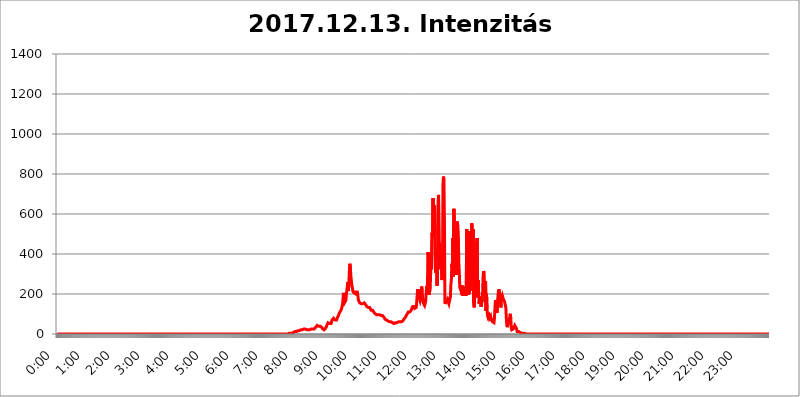
| Category | 2017.12.13. Intenzitás [W/m^2] |
|---|---|
| 0.0 | 0 |
| 0.0006944444444444445 | 0 |
| 0.001388888888888889 | 0 |
| 0.0020833333333333333 | 0 |
| 0.002777777777777778 | 0 |
| 0.003472222222222222 | 0 |
| 0.004166666666666667 | 0 |
| 0.004861111111111111 | 0 |
| 0.005555555555555556 | 0 |
| 0.0062499999999999995 | 0 |
| 0.006944444444444444 | 0 |
| 0.007638888888888889 | 0 |
| 0.008333333333333333 | 0 |
| 0.009027777777777779 | 0 |
| 0.009722222222222222 | 0 |
| 0.010416666666666666 | 0 |
| 0.011111111111111112 | 0 |
| 0.011805555555555555 | 0 |
| 0.012499999999999999 | 0 |
| 0.013194444444444444 | 0 |
| 0.013888888888888888 | 0 |
| 0.014583333333333332 | 0 |
| 0.015277777777777777 | 0 |
| 0.015972222222222224 | 0 |
| 0.016666666666666666 | 0 |
| 0.017361111111111112 | 0 |
| 0.018055555555555557 | 0 |
| 0.01875 | 0 |
| 0.019444444444444445 | 0 |
| 0.02013888888888889 | 0 |
| 0.020833333333333332 | 0 |
| 0.02152777777777778 | 0 |
| 0.022222222222222223 | 0 |
| 0.02291666666666667 | 0 |
| 0.02361111111111111 | 0 |
| 0.024305555555555556 | 0 |
| 0.024999999999999998 | 0 |
| 0.025694444444444447 | 0 |
| 0.02638888888888889 | 0 |
| 0.027083333333333334 | 0 |
| 0.027777777777777776 | 0 |
| 0.02847222222222222 | 0 |
| 0.029166666666666664 | 0 |
| 0.029861111111111113 | 0 |
| 0.030555555555555555 | 0 |
| 0.03125 | 0 |
| 0.03194444444444445 | 0 |
| 0.03263888888888889 | 0 |
| 0.03333333333333333 | 0 |
| 0.034027777777777775 | 0 |
| 0.034722222222222224 | 0 |
| 0.035416666666666666 | 0 |
| 0.036111111111111115 | 0 |
| 0.03680555555555556 | 0 |
| 0.0375 | 0 |
| 0.03819444444444444 | 0 |
| 0.03888888888888889 | 0 |
| 0.03958333333333333 | 0 |
| 0.04027777777777778 | 0 |
| 0.04097222222222222 | 0 |
| 0.041666666666666664 | 0 |
| 0.042361111111111106 | 0 |
| 0.04305555555555556 | 0 |
| 0.043750000000000004 | 0 |
| 0.044444444444444446 | 0 |
| 0.04513888888888889 | 0 |
| 0.04583333333333334 | 0 |
| 0.04652777777777778 | 0 |
| 0.04722222222222222 | 0 |
| 0.04791666666666666 | 0 |
| 0.04861111111111111 | 0 |
| 0.049305555555555554 | 0 |
| 0.049999999999999996 | 0 |
| 0.05069444444444445 | 0 |
| 0.051388888888888894 | 0 |
| 0.052083333333333336 | 0 |
| 0.05277777777777778 | 0 |
| 0.05347222222222222 | 0 |
| 0.05416666666666667 | 0 |
| 0.05486111111111111 | 0 |
| 0.05555555555555555 | 0 |
| 0.05625 | 0 |
| 0.05694444444444444 | 0 |
| 0.057638888888888885 | 0 |
| 0.05833333333333333 | 0 |
| 0.05902777777777778 | 0 |
| 0.059722222222222225 | 0 |
| 0.06041666666666667 | 0 |
| 0.061111111111111116 | 0 |
| 0.06180555555555556 | 0 |
| 0.0625 | 0 |
| 0.06319444444444444 | 0 |
| 0.06388888888888888 | 0 |
| 0.06458333333333334 | 0 |
| 0.06527777777777778 | 0 |
| 0.06597222222222222 | 0 |
| 0.06666666666666667 | 0 |
| 0.06736111111111111 | 0 |
| 0.06805555555555555 | 0 |
| 0.06874999999999999 | 0 |
| 0.06944444444444443 | 0 |
| 0.07013888888888889 | 0 |
| 0.07083333333333333 | 0 |
| 0.07152777777777779 | 0 |
| 0.07222222222222223 | 0 |
| 0.07291666666666667 | 0 |
| 0.07361111111111111 | 0 |
| 0.07430555555555556 | 0 |
| 0.075 | 0 |
| 0.07569444444444444 | 0 |
| 0.0763888888888889 | 0 |
| 0.07708333333333334 | 0 |
| 0.07777777777777778 | 0 |
| 0.07847222222222222 | 0 |
| 0.07916666666666666 | 0 |
| 0.0798611111111111 | 0 |
| 0.08055555555555556 | 0 |
| 0.08125 | 0 |
| 0.08194444444444444 | 0 |
| 0.08263888888888889 | 0 |
| 0.08333333333333333 | 0 |
| 0.08402777777777777 | 0 |
| 0.08472222222222221 | 0 |
| 0.08541666666666665 | 0 |
| 0.08611111111111112 | 0 |
| 0.08680555555555557 | 0 |
| 0.08750000000000001 | 0 |
| 0.08819444444444445 | 0 |
| 0.08888888888888889 | 0 |
| 0.08958333333333333 | 0 |
| 0.09027777777777778 | 0 |
| 0.09097222222222222 | 0 |
| 0.09166666666666667 | 0 |
| 0.09236111111111112 | 0 |
| 0.09305555555555556 | 0 |
| 0.09375 | 0 |
| 0.09444444444444444 | 0 |
| 0.09513888888888888 | 0 |
| 0.09583333333333333 | 0 |
| 0.09652777777777777 | 0 |
| 0.09722222222222222 | 0 |
| 0.09791666666666667 | 0 |
| 0.09861111111111111 | 0 |
| 0.09930555555555555 | 0 |
| 0.09999999999999999 | 0 |
| 0.10069444444444443 | 0 |
| 0.1013888888888889 | 0 |
| 0.10208333333333335 | 0 |
| 0.10277777777777779 | 0 |
| 0.10347222222222223 | 0 |
| 0.10416666666666667 | 0 |
| 0.10486111111111111 | 0 |
| 0.10555555555555556 | 0 |
| 0.10625 | 0 |
| 0.10694444444444444 | 0 |
| 0.1076388888888889 | 0 |
| 0.10833333333333334 | 0 |
| 0.10902777777777778 | 0 |
| 0.10972222222222222 | 0 |
| 0.1111111111111111 | 0 |
| 0.11180555555555556 | 0 |
| 0.11180555555555556 | 0 |
| 0.1125 | 0 |
| 0.11319444444444444 | 0 |
| 0.11388888888888889 | 0 |
| 0.11458333333333333 | 0 |
| 0.11527777777777777 | 0 |
| 0.11597222222222221 | 0 |
| 0.11666666666666665 | 0 |
| 0.1173611111111111 | 0 |
| 0.11805555555555557 | 0 |
| 0.11944444444444445 | 0 |
| 0.12013888888888889 | 0 |
| 0.12083333333333333 | 0 |
| 0.12152777777777778 | 0 |
| 0.12222222222222223 | 0 |
| 0.12291666666666667 | 0 |
| 0.12291666666666667 | 0 |
| 0.12361111111111112 | 0 |
| 0.12430555555555556 | 0 |
| 0.125 | 0 |
| 0.12569444444444444 | 0 |
| 0.12638888888888888 | 0 |
| 0.12708333333333333 | 0 |
| 0.16875 | 0 |
| 0.12847222222222224 | 0 |
| 0.12916666666666668 | 0 |
| 0.12986111111111112 | 0 |
| 0.13055555555555556 | 0 |
| 0.13125 | 0 |
| 0.13194444444444445 | 0 |
| 0.1326388888888889 | 0 |
| 0.13333333333333333 | 0 |
| 0.13402777777777777 | 0 |
| 0.13402777777777777 | 0 |
| 0.13472222222222222 | 0 |
| 0.13541666666666666 | 0 |
| 0.1361111111111111 | 0 |
| 0.13749999999999998 | 0 |
| 0.13819444444444443 | 0 |
| 0.1388888888888889 | 0 |
| 0.13958333333333334 | 0 |
| 0.14027777777777778 | 0 |
| 0.14097222222222222 | 0 |
| 0.14166666666666666 | 0 |
| 0.1423611111111111 | 0 |
| 0.14305555555555557 | 0 |
| 0.14375000000000002 | 0 |
| 0.14444444444444446 | 0 |
| 0.1451388888888889 | 0 |
| 0.1451388888888889 | 0 |
| 0.14652777777777778 | 0 |
| 0.14722222222222223 | 0 |
| 0.14791666666666667 | 0 |
| 0.1486111111111111 | 0 |
| 0.14930555555555555 | 0 |
| 0.15 | 0 |
| 0.15069444444444444 | 0 |
| 0.15138888888888888 | 0 |
| 0.15208333333333332 | 0 |
| 0.15277777777777776 | 0 |
| 0.15347222222222223 | 0 |
| 0.15416666666666667 | 0 |
| 0.15486111111111112 | 0 |
| 0.15555555555555556 | 0 |
| 0.15625 | 0 |
| 0.15694444444444444 | 0 |
| 0.15763888888888888 | 0 |
| 0.15833333333333333 | 0 |
| 0.15902777777777777 | 0 |
| 0.15972222222222224 | 0 |
| 0.16041666666666668 | 0 |
| 0.16111111111111112 | 0 |
| 0.16180555555555556 | 0 |
| 0.1625 | 0 |
| 0.16319444444444445 | 0 |
| 0.1638888888888889 | 0 |
| 0.16458333333333333 | 0 |
| 0.16527777777777777 | 0 |
| 0.16597222222222222 | 0 |
| 0.16666666666666666 | 0 |
| 0.1673611111111111 | 0 |
| 0.16805555555555554 | 0 |
| 0.16874999999999998 | 0 |
| 0.16944444444444443 | 0 |
| 0.17013888888888887 | 0 |
| 0.1708333333333333 | 0 |
| 0.17152777777777775 | 0 |
| 0.17222222222222225 | 0 |
| 0.1729166666666667 | 0 |
| 0.17361111111111113 | 0 |
| 0.17430555555555557 | 0 |
| 0.17500000000000002 | 0 |
| 0.17569444444444446 | 0 |
| 0.1763888888888889 | 0 |
| 0.17708333333333334 | 0 |
| 0.17777777777777778 | 0 |
| 0.17847222222222223 | 0 |
| 0.17916666666666667 | 0 |
| 0.1798611111111111 | 0 |
| 0.18055555555555555 | 0 |
| 0.18125 | 0 |
| 0.18194444444444444 | 0 |
| 0.1826388888888889 | 0 |
| 0.18333333333333335 | 0 |
| 0.1840277777777778 | 0 |
| 0.18472222222222223 | 0 |
| 0.18541666666666667 | 0 |
| 0.18611111111111112 | 0 |
| 0.18680555555555556 | 0 |
| 0.1875 | 0 |
| 0.18819444444444444 | 0 |
| 0.18888888888888888 | 0 |
| 0.18958333333333333 | 0 |
| 0.19027777777777777 | 0 |
| 0.1909722222222222 | 0 |
| 0.19166666666666665 | 0 |
| 0.19236111111111112 | 0 |
| 0.19305555555555554 | 0 |
| 0.19375 | 0 |
| 0.19444444444444445 | 0 |
| 0.1951388888888889 | 0 |
| 0.19583333333333333 | 0 |
| 0.19652777777777777 | 0 |
| 0.19722222222222222 | 0 |
| 0.19791666666666666 | 0 |
| 0.1986111111111111 | 0 |
| 0.19930555555555554 | 0 |
| 0.19999999999999998 | 0 |
| 0.20069444444444443 | 0 |
| 0.20138888888888887 | 0 |
| 0.2020833333333333 | 0 |
| 0.2027777777777778 | 0 |
| 0.2034722222222222 | 0 |
| 0.2041666666666667 | 0 |
| 0.20486111111111113 | 0 |
| 0.20555555555555557 | 0 |
| 0.20625000000000002 | 0 |
| 0.20694444444444446 | 0 |
| 0.2076388888888889 | 0 |
| 0.20833333333333334 | 0 |
| 0.20902777777777778 | 0 |
| 0.20972222222222223 | 0 |
| 0.21041666666666667 | 0 |
| 0.2111111111111111 | 0 |
| 0.21180555555555555 | 0 |
| 0.2125 | 0 |
| 0.21319444444444444 | 0 |
| 0.2138888888888889 | 0 |
| 0.21458333333333335 | 0 |
| 0.2152777777777778 | 0 |
| 0.21597222222222223 | 0 |
| 0.21666666666666667 | 0 |
| 0.21736111111111112 | 0 |
| 0.21805555555555556 | 0 |
| 0.21875 | 0 |
| 0.21944444444444444 | 0 |
| 0.22013888888888888 | 0 |
| 0.22083333333333333 | 0 |
| 0.22152777777777777 | 0 |
| 0.2222222222222222 | 0 |
| 0.22291666666666665 | 0 |
| 0.2236111111111111 | 0 |
| 0.22430555555555556 | 0 |
| 0.225 | 0 |
| 0.22569444444444445 | 0 |
| 0.2263888888888889 | 0 |
| 0.22708333333333333 | 0 |
| 0.22777777777777777 | 0 |
| 0.22847222222222222 | 0 |
| 0.22916666666666666 | 0 |
| 0.2298611111111111 | 0 |
| 0.23055555555555554 | 0 |
| 0.23124999999999998 | 0 |
| 0.23194444444444443 | 0 |
| 0.23263888888888887 | 0 |
| 0.2333333333333333 | 0 |
| 0.2340277777777778 | 0 |
| 0.2347222222222222 | 0 |
| 0.2354166666666667 | 0 |
| 0.23611111111111113 | 0 |
| 0.23680555555555557 | 0 |
| 0.23750000000000002 | 0 |
| 0.23819444444444446 | 0 |
| 0.2388888888888889 | 0 |
| 0.23958333333333334 | 0 |
| 0.24027777777777778 | 0 |
| 0.24097222222222223 | 0 |
| 0.24166666666666667 | 0 |
| 0.2423611111111111 | 0 |
| 0.24305555555555555 | 0 |
| 0.24375 | 0 |
| 0.24444444444444446 | 0 |
| 0.24513888888888888 | 0 |
| 0.24583333333333335 | 0 |
| 0.2465277777777778 | 0 |
| 0.24722222222222223 | 0 |
| 0.24791666666666667 | 0 |
| 0.24861111111111112 | 0 |
| 0.24930555555555556 | 0 |
| 0.25 | 0 |
| 0.25069444444444444 | 0 |
| 0.2513888888888889 | 0 |
| 0.2520833333333333 | 0 |
| 0.25277777777777777 | 0 |
| 0.2534722222222222 | 0 |
| 0.25416666666666665 | 0 |
| 0.2548611111111111 | 0 |
| 0.2555555555555556 | 0 |
| 0.25625000000000003 | 0 |
| 0.2569444444444445 | 0 |
| 0.2576388888888889 | 0 |
| 0.25833333333333336 | 0 |
| 0.2590277777777778 | 0 |
| 0.25972222222222224 | 0 |
| 0.2604166666666667 | 0 |
| 0.2611111111111111 | 0 |
| 0.26180555555555557 | 0 |
| 0.2625 | 0 |
| 0.26319444444444445 | 0 |
| 0.2638888888888889 | 0 |
| 0.26458333333333334 | 0 |
| 0.2652777777777778 | 0 |
| 0.2659722222222222 | 0 |
| 0.26666666666666666 | 0 |
| 0.2673611111111111 | 0 |
| 0.26805555555555555 | 0 |
| 0.26875 | 0 |
| 0.26944444444444443 | 0 |
| 0.2701388888888889 | 0 |
| 0.2708333333333333 | 0 |
| 0.27152777777777776 | 0 |
| 0.2722222222222222 | 0 |
| 0.27291666666666664 | 0 |
| 0.2736111111111111 | 0 |
| 0.2743055555555555 | 0 |
| 0.27499999999999997 | 0 |
| 0.27569444444444446 | 0 |
| 0.27638888888888885 | 0 |
| 0.27708333333333335 | 0 |
| 0.2777777777777778 | 0 |
| 0.27847222222222223 | 0 |
| 0.2791666666666667 | 0 |
| 0.2798611111111111 | 0 |
| 0.28055555555555556 | 0 |
| 0.28125 | 0 |
| 0.28194444444444444 | 0 |
| 0.2826388888888889 | 0 |
| 0.2833333333333333 | 0 |
| 0.28402777777777777 | 0 |
| 0.2847222222222222 | 0 |
| 0.28541666666666665 | 0 |
| 0.28611111111111115 | 0 |
| 0.28680555555555554 | 0 |
| 0.28750000000000003 | 0 |
| 0.2881944444444445 | 0 |
| 0.2888888888888889 | 0 |
| 0.28958333333333336 | 0 |
| 0.2902777777777778 | 0 |
| 0.29097222222222224 | 0 |
| 0.2916666666666667 | 0 |
| 0.2923611111111111 | 0 |
| 0.29305555555555557 | 0 |
| 0.29375 | 0 |
| 0.29444444444444445 | 0 |
| 0.2951388888888889 | 0 |
| 0.29583333333333334 | 0 |
| 0.2965277777777778 | 0 |
| 0.2972222222222222 | 0 |
| 0.29791666666666666 | 0 |
| 0.2986111111111111 | 0 |
| 0.29930555555555555 | 0 |
| 0.3 | 0 |
| 0.30069444444444443 | 0 |
| 0.3013888888888889 | 0 |
| 0.3020833333333333 | 0 |
| 0.30277777777777776 | 0 |
| 0.3034722222222222 | 0 |
| 0.30416666666666664 | 0 |
| 0.3048611111111111 | 0 |
| 0.3055555555555555 | 0 |
| 0.30624999999999997 | 0 |
| 0.3069444444444444 | 0 |
| 0.3076388888888889 | 0 |
| 0.30833333333333335 | 0 |
| 0.3090277777777778 | 0 |
| 0.30972222222222223 | 0 |
| 0.3104166666666667 | 0 |
| 0.3111111111111111 | 0 |
| 0.31180555555555556 | 0 |
| 0.3125 | 0 |
| 0.31319444444444444 | 0 |
| 0.3138888888888889 | 0 |
| 0.3145833333333333 | 0 |
| 0.31527777777777777 | 0 |
| 0.3159722222222222 | 0 |
| 0.31666666666666665 | 0 |
| 0.31736111111111115 | 0 |
| 0.31805555555555554 | 0 |
| 0.31875000000000003 | 0 |
| 0.3194444444444445 | 0 |
| 0.3201388888888889 | 0 |
| 0.32083333333333336 | 0 |
| 0.3215277777777778 | 0 |
| 0.32222222222222224 | 0 |
| 0.3229166666666667 | 0 |
| 0.3236111111111111 | 3.525 |
| 0.32430555555555557 | 3.525 |
| 0.325 | 3.525 |
| 0.32569444444444445 | 3.525 |
| 0.3263888888888889 | 3.525 |
| 0.32708333333333334 | 3.525 |
| 0.3277777777777778 | 3.525 |
| 0.3284722222222222 | 3.525 |
| 0.32916666666666666 | 3.525 |
| 0.3298611111111111 | 7.887 |
| 0.33055555555555555 | 7.887 |
| 0.33125 | 7.887 |
| 0.33194444444444443 | 7.887 |
| 0.3326388888888889 | 12.257 |
| 0.3333333333333333 | 12.257 |
| 0.3340277777777778 | 12.257 |
| 0.3347222222222222 | 12.257 |
| 0.3354166666666667 | 12.257 |
| 0.3361111111111111 | 16.636 |
| 0.3368055555555556 | 16.636 |
| 0.33749999999999997 | 16.636 |
| 0.33819444444444446 | 21.024 |
| 0.33888888888888885 | 16.636 |
| 0.33958333333333335 | 16.636 |
| 0.34027777777777773 | 21.024 |
| 0.34097222222222223 | 21.024 |
| 0.3416666666666666 | 21.024 |
| 0.3423611111111111 | 21.024 |
| 0.3430555555555555 | 21.024 |
| 0.34375 | 21.024 |
| 0.3444444444444445 | 21.024 |
| 0.3451388888888889 | 21.024 |
| 0.3458333333333334 | 25.419 |
| 0.34652777777777777 | 25.419 |
| 0.34722222222222227 | 25.419 |
| 0.34791666666666665 | 25.419 |
| 0.34861111111111115 | 25.419 |
| 0.34930555555555554 | 21.024 |
| 0.35000000000000003 | 21.024 |
| 0.3506944444444444 | 21.024 |
| 0.3513888888888889 | 21.024 |
| 0.3520833333333333 | 21.024 |
| 0.3527777777777778 | 21.024 |
| 0.3534722222222222 | 21.024 |
| 0.3541666666666667 | 21.024 |
| 0.3548611111111111 | 21.024 |
| 0.35555555555555557 | 21.024 |
| 0.35625 | 25.419 |
| 0.35694444444444445 | 25.419 |
| 0.3576388888888889 | 25.419 |
| 0.35833333333333334 | 25.419 |
| 0.3590277777777778 | 25.419 |
| 0.3597222222222222 | 25.419 |
| 0.36041666666666666 | 25.419 |
| 0.3611111111111111 | 29.823 |
| 0.36180555555555555 | 29.823 |
| 0.3625 | 34.234 |
| 0.36319444444444443 | 38.653 |
| 0.3638888888888889 | 38.653 |
| 0.3645833333333333 | 43.079 |
| 0.3652777777777778 | 38.653 |
| 0.3659722222222222 | 38.653 |
| 0.3666666666666667 | 38.653 |
| 0.3673611111111111 | 38.653 |
| 0.3680555555555556 | 38.653 |
| 0.36874999999999997 | 38.653 |
| 0.36944444444444446 | 38.653 |
| 0.37013888888888885 | 38.653 |
| 0.37083333333333335 | 34.234 |
| 0.37152777777777773 | 29.823 |
| 0.37222222222222223 | 25.419 |
| 0.3729166666666666 | 25.419 |
| 0.3736111111111111 | 25.419 |
| 0.3743055555555555 | 21.024 |
| 0.375 | 21.024 |
| 0.3756944444444445 | 25.419 |
| 0.3763888888888889 | 29.823 |
| 0.3770833333333334 | 34.234 |
| 0.37777777777777777 | 38.653 |
| 0.37847222222222227 | 47.511 |
| 0.37916666666666665 | 51.951 |
| 0.37986111111111115 | 56.398 |
| 0.38055555555555554 | 56.398 |
| 0.38125000000000003 | 56.398 |
| 0.3819444444444444 | 51.951 |
| 0.3826388888888889 | 51.951 |
| 0.3833333333333333 | 51.951 |
| 0.3840277777777778 | 51.951 |
| 0.3847222222222222 | 60.85 |
| 0.3854166666666667 | 69.775 |
| 0.3861111111111111 | 74.246 |
| 0.38680555555555557 | 74.246 |
| 0.3875 | 78.722 |
| 0.38819444444444445 | 83.205 |
| 0.3888888888888889 | 78.722 |
| 0.38958333333333334 | 69.775 |
| 0.3902777777777778 | 65.31 |
| 0.3909722222222222 | 65.31 |
| 0.39166666666666666 | 69.775 |
| 0.3923611111111111 | 74.246 |
| 0.39305555555555555 | 83.205 |
| 0.39375 | 87.692 |
| 0.39444444444444443 | 92.184 |
| 0.3951388888888889 | 101.184 |
| 0.3958333333333333 | 105.69 |
| 0.3965277777777778 | 110.201 |
| 0.3972222222222222 | 110.201 |
| 0.3979166666666667 | 114.716 |
| 0.3986111111111111 | 123.758 |
| 0.3993055555555556 | 137.347 |
| 0.39999999999999997 | 146.423 |
| 0.40069444444444446 | 169.156 |
| 0.40138888888888885 | 205.62 |
| 0.40208333333333335 | 173.709 |
| 0.40277777777777773 | 155.509 |
| 0.40347222222222223 | 160.056 |
| 0.4041666666666666 | 155.509 |
| 0.4048611111111111 | 169.156 |
| 0.4055555555555555 | 201.058 |
| 0.40625 | 219.309 |
| 0.4069444444444445 | 242.127 |
| 0.4076388888888889 | 260.373 |
| 0.4083333333333334 | 214.746 |
| 0.40902777777777777 | 251.251 |
| 0.40972222222222227 | 314.98 |
| 0.41041666666666665 | 351.198 |
| 0.41111111111111115 | 328.584 |
| 0.41180555555555554 | 292.259 |
| 0.41250000000000003 | 264.932 |
| 0.4131944444444444 | 242.127 |
| 0.4138888888888889 | 233 |
| 0.4145833333333333 | 214.746 |
| 0.4152777777777778 | 210.182 |
| 0.4159722222222222 | 205.62 |
| 0.4166666666666667 | 205.62 |
| 0.4173611111111111 | 205.62 |
| 0.41805555555555557 | 201.058 |
| 0.41875 | 210.182 |
| 0.41944444444444445 | 214.746 |
| 0.4201388888888889 | 214.746 |
| 0.42083333333333334 | 210.182 |
| 0.4215277777777778 | 196.497 |
| 0.4222222222222222 | 173.709 |
| 0.42291666666666666 | 164.605 |
| 0.4236111111111111 | 160.056 |
| 0.42430555555555555 | 155.509 |
| 0.425 | 155.509 |
| 0.42569444444444443 | 150.964 |
| 0.4263888888888889 | 150.964 |
| 0.4270833333333333 | 150.964 |
| 0.4277777777777778 | 155.509 |
| 0.4284722222222222 | 150.964 |
| 0.4291666666666667 | 155.509 |
| 0.4298611111111111 | 155.509 |
| 0.4305555555555556 | 155.509 |
| 0.43124999999999997 | 155.509 |
| 0.43194444444444446 | 155.509 |
| 0.43263888888888885 | 146.423 |
| 0.43333333333333335 | 141.884 |
| 0.43402777777777773 | 137.347 |
| 0.43472222222222223 | 137.347 |
| 0.4354166666666666 | 132.814 |
| 0.4361111111111111 | 132.814 |
| 0.4368055555555555 | 132.814 |
| 0.4375 | 132.814 |
| 0.4381944444444445 | 132.814 |
| 0.4388888888888889 | 128.284 |
| 0.4395833333333334 | 128.284 |
| 0.44027777777777777 | 119.235 |
| 0.44097222222222227 | 119.235 |
| 0.44166666666666665 | 119.235 |
| 0.44236111111111115 | 119.235 |
| 0.44305555555555554 | 114.716 |
| 0.44375000000000003 | 110.201 |
| 0.4444444444444444 | 110.201 |
| 0.4451388888888889 | 105.69 |
| 0.4458333333333333 | 101.184 |
| 0.4465277777777778 | 101.184 |
| 0.4472222222222222 | 96.682 |
| 0.4479166666666667 | 96.682 |
| 0.4486111111111111 | 92.184 |
| 0.44930555555555557 | 96.682 |
| 0.45 | 96.682 |
| 0.45069444444444445 | 101.184 |
| 0.4513888888888889 | 96.682 |
| 0.45208333333333334 | 96.682 |
| 0.4527777777777778 | 96.682 |
| 0.4534722222222222 | 92.184 |
| 0.45416666666666666 | 92.184 |
| 0.4548611111111111 | 92.184 |
| 0.45555555555555555 | 92.184 |
| 0.45625 | 92.184 |
| 0.45694444444444443 | 87.692 |
| 0.4576388888888889 | 87.692 |
| 0.4583333333333333 | 83.205 |
| 0.4590277777777778 | 78.722 |
| 0.4597222222222222 | 74.246 |
| 0.4604166666666667 | 74.246 |
| 0.4611111111111111 | 69.775 |
| 0.4618055555555556 | 69.775 |
| 0.46249999999999997 | 65.31 |
| 0.46319444444444446 | 65.31 |
| 0.46388888888888885 | 65.31 |
| 0.46458333333333335 | 60.85 |
| 0.46527777777777773 | 60.85 |
| 0.46597222222222223 | 60.85 |
| 0.4666666666666666 | 60.85 |
| 0.4673611111111111 | 60.85 |
| 0.4680555555555555 | 60.85 |
| 0.46875 | 60.85 |
| 0.4694444444444445 | 60.85 |
| 0.4701388888888889 | 56.398 |
| 0.4708333333333334 | 56.398 |
| 0.47152777777777777 | 51.951 |
| 0.47222222222222227 | 51.951 |
| 0.47291666666666665 | 51.951 |
| 0.47361111111111115 | 51.951 |
| 0.47430555555555554 | 56.398 |
| 0.47500000000000003 | 56.398 |
| 0.4756944444444444 | 56.398 |
| 0.4763888888888889 | 56.398 |
| 0.4770833333333333 | 56.398 |
| 0.4777777777777778 | 60.85 |
| 0.4784722222222222 | 60.85 |
| 0.4791666666666667 | 65.31 |
| 0.4798611111111111 | 65.31 |
| 0.48055555555555557 | 60.85 |
| 0.48125 | 60.85 |
| 0.48194444444444445 | 60.85 |
| 0.4826388888888889 | 60.85 |
| 0.48333333333333334 | 60.85 |
| 0.4840277777777778 | 65.31 |
| 0.4847222222222222 | 65.31 |
| 0.48541666666666666 | 69.775 |
| 0.4861111111111111 | 74.246 |
| 0.48680555555555555 | 74.246 |
| 0.4875 | 78.722 |
| 0.48819444444444443 | 83.205 |
| 0.4888888888888889 | 87.692 |
| 0.4895833333333333 | 92.184 |
| 0.4902777777777778 | 96.682 |
| 0.4909722222222222 | 101.184 |
| 0.4916666666666667 | 105.69 |
| 0.4923611111111111 | 110.201 |
| 0.4930555555555556 | 110.201 |
| 0.49374999999999997 | 110.201 |
| 0.49444444444444446 | 110.201 |
| 0.49513888888888885 | 114.716 |
| 0.49583333333333335 | 114.716 |
| 0.49652777777777773 | 119.235 |
| 0.49722222222222223 | 128.284 |
| 0.4979166666666666 | 132.814 |
| 0.4986111111111111 | 137.347 |
| 0.4993055555555555 | 137.347 |
| 0.5 | 141.884 |
| 0.5006944444444444 | 137.347 |
| 0.5013888888888889 | 128.284 |
| 0.5020833333333333 | 123.758 |
| 0.5027777777777778 | 123.758 |
| 0.5034722222222222 | 132.814 |
| 0.5041666666666667 | 160.056 |
| 0.5048611111111111 | 196.497 |
| 0.5055555555555555 | 223.873 |
| 0.50625 | 205.62 |
| 0.5069444444444444 | 223.873 |
| 0.5076388888888889 | 191.937 |
| 0.5083333333333333 | 173.709 |
| 0.5090277777777777 | 164.605 |
| 0.5097222222222222 | 173.709 |
| 0.5104166666666666 | 178.264 |
| 0.5111111111111112 | 237.564 |
| 0.5118055555555555 | 214.746 |
| 0.5125000000000001 | 173.709 |
| 0.5131944444444444 | 160.056 |
| 0.513888888888889 | 150.964 |
| 0.5145833333333333 | 146.423 |
| 0.5152777777777778 | 141.884 |
| 0.5159722222222222 | 150.964 |
| 0.5166666666666667 | 164.605 |
| 0.517361111111111 | 164.605 |
| 0.5180555555555556 | 237.564 |
| 0.5187499999999999 | 196.497 |
| 0.5194444444444445 | 287.709 |
| 0.5201388888888888 | 409.574 |
| 0.5208333333333334 | 278.603 |
| 0.5215277777777778 | 196.497 |
| 0.5222222222222223 | 210.182 |
| 0.5229166666666667 | 219.309 |
| 0.5236111111111111 | 287.709 |
| 0.5243055555555556 | 400.638 |
| 0.525 | 324.052 |
| 0.5256944444444445 | 506.542 |
| 0.5263888888888889 | 484.735 |
| 0.5270833333333333 | 679.395 |
| 0.5277777777777778 | 497.836 |
| 0.5284722222222222 | 588.009 |
| 0.5291666666666667 | 642.4 |
| 0.5298611111111111 | 497.836 |
| 0.5305555555555556 | 305.898 |
| 0.53125 | 355.712 |
| 0.5319444444444444 | 414.035 |
| 0.5326388888888889 | 242.127 |
| 0.5333333333333333 | 296.808 |
| 0.5340277777777778 | 650.667 |
| 0.5347222222222222 | 695.666 |
| 0.5354166666666667 | 462.786 |
| 0.5361111111111111 | 467.187 |
| 0.5368055555555555 | 449.551 |
| 0.5375 | 324.052 |
| 0.5381944444444444 | 324.052 |
| 0.5388888888888889 | 405.108 |
| 0.5395833333333333 | 269.49 |
| 0.5402777777777777 | 314.98 |
| 0.5409722222222222 | 747.834 |
| 0.5416666666666666 | 787.258 |
| 0.5423611111111112 | 767.62 |
| 0.5430555555555555 | 553.986 |
| 0.5437500000000001 | 150.964 |
| 0.5444444444444444 | 150.964 |
| 0.545138888888889 | 155.509 |
| 0.5458333333333333 | 164.605 |
| 0.5465277777777778 | 169.156 |
| 0.5472222222222222 | 173.709 |
| 0.5479166666666667 | 164.605 |
| 0.548611111111111 | 160.056 |
| 0.5493055555555556 | 150.964 |
| 0.5499999999999999 | 146.423 |
| 0.5506944444444445 | 155.509 |
| 0.5513888888888888 | 187.378 |
| 0.5520833333333334 | 246.689 |
| 0.5527777777777778 | 274.047 |
| 0.5534722222222223 | 351.198 |
| 0.5541666666666667 | 328.584 |
| 0.5548611111111111 | 480.356 |
| 0.5555555555555556 | 287.709 |
| 0.55625 | 625.784 |
| 0.5569444444444445 | 553.986 |
| 0.5576388888888889 | 414.035 |
| 0.5583333333333333 | 378.224 |
| 0.5590277777777778 | 387.202 |
| 0.5597222222222222 | 296.808 |
| 0.5604166666666667 | 342.162 |
| 0.5611111111111111 | 562.53 |
| 0.5618055555555556 | 536.82 |
| 0.5625 | 502.192 |
| 0.5631944444444444 | 355.712 |
| 0.5638888888888889 | 305.898 |
| 0.5645833333333333 | 233 |
| 0.5652777777777778 | 237.564 |
| 0.5659722222222222 | 219.309 |
| 0.5666666666666667 | 210.182 |
| 0.5673611111111111 | 196.497 |
| 0.5680555555555555 | 242.127 |
| 0.56875 | 191.937 |
| 0.5694444444444444 | 191.937 |
| 0.5701388888888889 | 214.746 |
| 0.5708333333333333 | 237.564 |
| 0.5715277777777777 | 210.182 |
| 0.5722222222222222 | 191.937 |
| 0.5729166666666666 | 205.62 |
| 0.5736111111111112 | 191.937 |
| 0.5743055555555555 | 523.88 |
| 0.5750000000000001 | 462.786 |
| 0.5756944444444444 | 292.259 |
| 0.576388888888889 | 196.497 |
| 0.5770833333333333 | 210.182 |
| 0.5777777777777778 | 201.058 |
| 0.5784722222222222 | 515.223 |
| 0.5791666666666667 | 296.808 |
| 0.579861111111111 | 214.746 |
| 0.5805555555555556 | 364.728 |
| 0.5812499999999999 | 553.986 |
| 0.5819444444444445 | 532.513 |
| 0.5826388888888888 | 387.202 |
| 0.5833333333333334 | 523.88 |
| 0.5840277777777778 | 155.509 |
| 0.5847222222222223 | 132.814 |
| 0.5854166666666667 | 182.82 |
| 0.5861111111111111 | 333.113 |
| 0.5868055555555556 | 387.202 |
| 0.5875 | 458.38 |
| 0.5881944444444445 | 360.221 |
| 0.5888888888888889 | 480.356 |
| 0.5895833333333333 | 182.82 |
| 0.5902777777777778 | 269.49 |
| 0.5909722222222222 | 214.746 |
| 0.5916666666666667 | 150.964 |
| 0.5923611111111111 | 146.423 |
| 0.5930555555555556 | 187.378 |
| 0.59375 | 182.82 |
| 0.5944444444444444 | 137.347 |
| 0.5951388888888889 | 146.423 |
| 0.5958333333333333 | 150.964 |
| 0.5965277777777778 | 201.058 |
| 0.5972222222222222 | 283.156 |
| 0.5979166666666667 | 314.98 |
| 0.5986111111111111 | 305.898 |
| 0.5993055555555555 | 246.689 |
| 0.6 | 160.056 |
| 0.6006944444444444 | 264.932 |
| 0.6013888888888889 | 114.716 |
| 0.6020833333333333 | 201.058 |
| 0.6027777777777777 | 123.758 |
| 0.6034722222222222 | 92.184 |
| 0.6041666666666666 | 83.205 |
| 0.6048611111111112 | 87.692 |
| 0.6055555555555555 | 92.184 |
| 0.6062500000000001 | 78.722 |
| 0.6069444444444444 | 74.246 |
| 0.607638888888889 | 87.692 |
| 0.6083333333333333 | 65.31 |
| 0.6090277777777778 | 74.246 |
| 0.6097222222222222 | 78.722 |
| 0.6104166666666667 | 60.85 |
| 0.611111111111111 | 56.398 |
| 0.6118055555555556 | 56.398 |
| 0.6124999999999999 | 56.398 |
| 0.6131944444444445 | 78.722 |
| 0.6138888888888888 | 128.284 |
| 0.6145833333333334 | 169.156 |
| 0.6152777777777778 | 146.423 |
| 0.6159722222222223 | 119.235 |
| 0.6166666666666667 | 105.69 |
| 0.6173611111111111 | 132.814 |
| 0.6180555555555556 | 187.378 |
| 0.61875 | 214.746 |
| 0.6194444444444445 | 223.873 |
| 0.6201388888888889 | 223.873 |
| 0.6208333333333333 | 191.937 |
| 0.6215277777777778 | 191.937 |
| 0.6222222222222222 | 132.814 |
| 0.6229166666666667 | 201.058 |
| 0.6236111111111111 | 182.82 |
| 0.6243055555555556 | 191.937 |
| 0.625 | 182.82 |
| 0.6256944444444444 | 173.709 |
| 0.6263888888888889 | 169.156 |
| 0.6270833333333333 | 164.605 |
| 0.6277777777777778 | 164.605 |
| 0.6284722222222222 | 160.056 |
| 0.6291666666666667 | 132.814 |
| 0.6298611111111111 | 78.722 |
| 0.6305555555555555 | 43.079 |
| 0.63125 | 34.234 |
| 0.6319444444444444 | 38.653 |
| 0.6326388888888889 | 38.653 |
| 0.6333333333333333 | 65.31 |
| 0.6340277777777777 | 74.246 |
| 0.6347222222222222 | 87.692 |
| 0.6354166666666666 | 101.184 |
| 0.6361111111111112 | 74.246 |
| 0.6368055555555555 | 29.823 |
| 0.6375000000000001 | 21.024 |
| 0.6381944444444444 | 21.024 |
| 0.638888888888889 | 25.419 |
| 0.6395833333333333 | 25.419 |
| 0.6402777777777778 | 21.024 |
| 0.6409722222222222 | 29.823 |
| 0.6416666666666667 | 43.079 |
| 0.642361111111111 | 47.511 |
| 0.6430555555555556 | 38.653 |
| 0.6437499999999999 | 29.823 |
| 0.6444444444444445 | 21.024 |
| 0.6451388888888888 | 12.257 |
| 0.6458333333333334 | 12.257 |
| 0.6465277777777778 | 7.887 |
| 0.6472222222222223 | 12.257 |
| 0.6479166666666667 | 7.887 |
| 0.6486111111111111 | 7.887 |
| 0.6493055555555556 | 7.887 |
| 0.65 | 3.525 |
| 0.6506944444444445 | 3.525 |
| 0.6513888888888889 | 3.525 |
| 0.6520833333333333 | 3.525 |
| 0.6527777777777778 | 3.525 |
| 0.6534722222222222 | 3.525 |
| 0.6541666666666667 | 3.525 |
| 0.6548611111111111 | 3.525 |
| 0.6555555555555556 | 3.525 |
| 0.65625 | 0 |
| 0.6569444444444444 | 0 |
| 0.6576388888888889 | 0 |
| 0.6583333333333333 | 0 |
| 0.6590277777777778 | 0 |
| 0.6597222222222222 | 0 |
| 0.6604166666666667 | 0 |
| 0.6611111111111111 | 0 |
| 0.6618055555555555 | 0 |
| 0.6625 | 0 |
| 0.6631944444444444 | 0 |
| 0.6638888888888889 | 0 |
| 0.6645833333333333 | 0 |
| 0.6652777777777777 | 0 |
| 0.6659722222222222 | 0 |
| 0.6666666666666666 | 0 |
| 0.6673611111111111 | 0 |
| 0.6680555555555556 | 0 |
| 0.6687500000000001 | 0 |
| 0.6694444444444444 | 0 |
| 0.6701388888888888 | 0 |
| 0.6708333333333334 | 0 |
| 0.6715277777777778 | 0 |
| 0.6722222222222222 | 0 |
| 0.6729166666666666 | 0 |
| 0.6736111111111112 | 0 |
| 0.6743055555555556 | 0 |
| 0.6749999999999999 | 0 |
| 0.6756944444444444 | 0 |
| 0.6763888888888889 | 0 |
| 0.6770833333333334 | 0 |
| 0.6777777777777777 | 0 |
| 0.6784722222222223 | 0 |
| 0.6791666666666667 | 0 |
| 0.6798611111111111 | 0 |
| 0.6805555555555555 | 0 |
| 0.68125 | 0 |
| 0.6819444444444445 | 0 |
| 0.6826388888888889 | 0 |
| 0.6833333333333332 | 0 |
| 0.6840277777777778 | 0 |
| 0.6847222222222222 | 0 |
| 0.6854166666666667 | 0 |
| 0.686111111111111 | 0 |
| 0.6868055555555556 | 0 |
| 0.6875 | 0 |
| 0.6881944444444444 | 0 |
| 0.688888888888889 | 0 |
| 0.6895833333333333 | 0 |
| 0.6902777777777778 | 0 |
| 0.6909722222222222 | 0 |
| 0.6916666666666668 | 0 |
| 0.6923611111111111 | 0 |
| 0.6930555555555555 | 0 |
| 0.69375 | 0 |
| 0.6944444444444445 | 0 |
| 0.6951388888888889 | 0 |
| 0.6958333333333333 | 0 |
| 0.6965277777777777 | 0 |
| 0.6972222222222223 | 0 |
| 0.6979166666666666 | 0 |
| 0.6986111111111111 | 0 |
| 0.6993055555555556 | 0 |
| 0.7000000000000001 | 0 |
| 0.7006944444444444 | 0 |
| 0.7013888888888888 | 0 |
| 0.7020833333333334 | 0 |
| 0.7027777777777778 | 0 |
| 0.7034722222222222 | 0 |
| 0.7041666666666666 | 0 |
| 0.7048611111111112 | 0 |
| 0.7055555555555556 | 0 |
| 0.7062499999999999 | 0 |
| 0.7069444444444444 | 0 |
| 0.7076388888888889 | 0 |
| 0.7083333333333334 | 0 |
| 0.7090277777777777 | 0 |
| 0.7097222222222223 | 0 |
| 0.7104166666666667 | 0 |
| 0.7111111111111111 | 0 |
| 0.7118055555555555 | 0 |
| 0.7125 | 0 |
| 0.7131944444444445 | 0 |
| 0.7138888888888889 | 0 |
| 0.7145833333333332 | 0 |
| 0.7152777777777778 | 0 |
| 0.7159722222222222 | 0 |
| 0.7166666666666667 | 0 |
| 0.717361111111111 | 0 |
| 0.7180555555555556 | 0 |
| 0.71875 | 0 |
| 0.7194444444444444 | 0 |
| 0.720138888888889 | 0 |
| 0.7208333333333333 | 0 |
| 0.7215277777777778 | 0 |
| 0.7222222222222222 | 0 |
| 0.7229166666666668 | 0 |
| 0.7236111111111111 | 0 |
| 0.7243055555555555 | 0 |
| 0.725 | 0 |
| 0.7256944444444445 | 0 |
| 0.7263888888888889 | 0 |
| 0.7270833333333333 | 0 |
| 0.7277777777777777 | 0 |
| 0.7284722222222223 | 0 |
| 0.7291666666666666 | 0 |
| 0.7298611111111111 | 0 |
| 0.7305555555555556 | 0 |
| 0.7312500000000001 | 0 |
| 0.7319444444444444 | 0 |
| 0.7326388888888888 | 0 |
| 0.7333333333333334 | 0 |
| 0.7340277777777778 | 0 |
| 0.7347222222222222 | 0 |
| 0.7354166666666666 | 0 |
| 0.7361111111111112 | 0 |
| 0.7368055555555556 | 0 |
| 0.7374999999999999 | 0 |
| 0.7381944444444444 | 0 |
| 0.7388888888888889 | 0 |
| 0.7395833333333334 | 0 |
| 0.7402777777777777 | 0 |
| 0.7409722222222223 | 0 |
| 0.7416666666666667 | 0 |
| 0.7423611111111111 | 0 |
| 0.7430555555555555 | 0 |
| 0.74375 | 0 |
| 0.7444444444444445 | 0 |
| 0.7451388888888889 | 0 |
| 0.7458333333333332 | 0 |
| 0.7465277777777778 | 0 |
| 0.7472222222222222 | 0 |
| 0.7479166666666667 | 0 |
| 0.748611111111111 | 0 |
| 0.7493055555555556 | 0 |
| 0.75 | 0 |
| 0.7506944444444444 | 0 |
| 0.751388888888889 | 0 |
| 0.7520833333333333 | 0 |
| 0.7527777777777778 | 0 |
| 0.7534722222222222 | 0 |
| 0.7541666666666668 | 0 |
| 0.7548611111111111 | 0 |
| 0.7555555555555555 | 0 |
| 0.75625 | 0 |
| 0.7569444444444445 | 0 |
| 0.7576388888888889 | 0 |
| 0.7583333333333333 | 0 |
| 0.7590277777777777 | 0 |
| 0.7597222222222223 | 0 |
| 0.7604166666666666 | 0 |
| 0.7611111111111111 | 0 |
| 0.7618055555555556 | 0 |
| 0.7625000000000001 | 0 |
| 0.7631944444444444 | 0 |
| 0.7638888888888888 | 0 |
| 0.7645833333333334 | 0 |
| 0.7652777777777778 | 0 |
| 0.7659722222222222 | 0 |
| 0.7666666666666666 | 0 |
| 0.7673611111111112 | 0 |
| 0.7680555555555556 | 0 |
| 0.7687499999999999 | 0 |
| 0.7694444444444444 | 0 |
| 0.7701388888888889 | 0 |
| 0.7708333333333334 | 0 |
| 0.7715277777777777 | 0 |
| 0.7722222222222223 | 0 |
| 0.7729166666666667 | 0 |
| 0.7736111111111111 | 0 |
| 0.7743055555555555 | 0 |
| 0.775 | 0 |
| 0.7756944444444445 | 0 |
| 0.7763888888888889 | 0 |
| 0.7770833333333332 | 0 |
| 0.7777777777777778 | 0 |
| 0.7784722222222222 | 0 |
| 0.7791666666666667 | 0 |
| 0.779861111111111 | 0 |
| 0.7805555555555556 | 0 |
| 0.78125 | 0 |
| 0.7819444444444444 | 0 |
| 0.782638888888889 | 0 |
| 0.7833333333333333 | 0 |
| 0.7840277777777778 | 0 |
| 0.7847222222222222 | 0 |
| 0.7854166666666668 | 0 |
| 0.7861111111111111 | 0 |
| 0.7868055555555555 | 0 |
| 0.7875 | 0 |
| 0.7881944444444445 | 0 |
| 0.7888888888888889 | 0 |
| 0.7895833333333333 | 0 |
| 0.7902777777777777 | 0 |
| 0.7909722222222223 | 0 |
| 0.7916666666666666 | 0 |
| 0.7923611111111111 | 0 |
| 0.7930555555555556 | 0 |
| 0.7937500000000001 | 0 |
| 0.7944444444444444 | 0 |
| 0.7951388888888888 | 0 |
| 0.7958333333333334 | 0 |
| 0.7965277777777778 | 0 |
| 0.7972222222222222 | 0 |
| 0.7979166666666666 | 0 |
| 0.7986111111111112 | 0 |
| 0.7993055555555556 | 0 |
| 0.7999999999999999 | 0 |
| 0.8006944444444444 | 0 |
| 0.8013888888888889 | 0 |
| 0.8020833333333334 | 0 |
| 0.8027777777777777 | 0 |
| 0.8034722222222223 | 0 |
| 0.8041666666666667 | 0 |
| 0.8048611111111111 | 0 |
| 0.8055555555555555 | 0 |
| 0.80625 | 0 |
| 0.8069444444444445 | 0 |
| 0.8076388888888889 | 0 |
| 0.8083333333333332 | 0 |
| 0.8090277777777778 | 0 |
| 0.8097222222222222 | 0 |
| 0.8104166666666667 | 0 |
| 0.811111111111111 | 0 |
| 0.8118055555555556 | 0 |
| 0.8125 | 0 |
| 0.8131944444444444 | 0 |
| 0.813888888888889 | 0 |
| 0.8145833333333333 | 0 |
| 0.8152777777777778 | 0 |
| 0.8159722222222222 | 0 |
| 0.8166666666666668 | 0 |
| 0.8173611111111111 | 0 |
| 0.8180555555555555 | 0 |
| 0.81875 | 0 |
| 0.8194444444444445 | 0 |
| 0.8201388888888889 | 0 |
| 0.8208333333333333 | 0 |
| 0.8215277777777777 | 0 |
| 0.8222222222222223 | 0 |
| 0.8229166666666666 | 0 |
| 0.8236111111111111 | 0 |
| 0.8243055555555556 | 0 |
| 0.8250000000000001 | 0 |
| 0.8256944444444444 | 0 |
| 0.8263888888888888 | 0 |
| 0.8270833333333334 | 0 |
| 0.8277777777777778 | 0 |
| 0.8284722222222222 | 0 |
| 0.8291666666666666 | 0 |
| 0.8298611111111112 | 0 |
| 0.8305555555555556 | 0 |
| 0.8312499999999999 | 0 |
| 0.8319444444444444 | 0 |
| 0.8326388888888889 | 0 |
| 0.8333333333333334 | 0 |
| 0.8340277777777777 | 0 |
| 0.8347222222222223 | 0 |
| 0.8354166666666667 | 0 |
| 0.8361111111111111 | 0 |
| 0.8368055555555555 | 0 |
| 0.8375 | 0 |
| 0.8381944444444445 | 0 |
| 0.8388888888888889 | 0 |
| 0.8395833333333332 | 0 |
| 0.8402777777777778 | 0 |
| 0.8409722222222222 | 0 |
| 0.8416666666666667 | 0 |
| 0.842361111111111 | 0 |
| 0.8430555555555556 | 0 |
| 0.84375 | 0 |
| 0.8444444444444444 | 0 |
| 0.845138888888889 | 0 |
| 0.8458333333333333 | 0 |
| 0.8465277777777778 | 0 |
| 0.8472222222222222 | 0 |
| 0.8479166666666668 | 0 |
| 0.8486111111111111 | 0 |
| 0.8493055555555555 | 0 |
| 0.85 | 0 |
| 0.8506944444444445 | 0 |
| 0.8513888888888889 | 0 |
| 0.8520833333333333 | 0 |
| 0.8527777777777777 | 0 |
| 0.8534722222222223 | 0 |
| 0.8541666666666666 | 0 |
| 0.8548611111111111 | 0 |
| 0.8555555555555556 | 0 |
| 0.8562500000000001 | 0 |
| 0.8569444444444444 | 0 |
| 0.8576388888888888 | 0 |
| 0.8583333333333334 | 0 |
| 0.8590277777777778 | 0 |
| 0.8597222222222222 | 0 |
| 0.8604166666666666 | 0 |
| 0.8611111111111112 | 0 |
| 0.8618055555555556 | 0 |
| 0.8624999999999999 | 0 |
| 0.8631944444444444 | 0 |
| 0.8638888888888889 | 0 |
| 0.8645833333333334 | 0 |
| 0.8652777777777777 | 0 |
| 0.8659722222222223 | 0 |
| 0.8666666666666667 | 0 |
| 0.8673611111111111 | 0 |
| 0.8680555555555555 | 0 |
| 0.86875 | 0 |
| 0.8694444444444445 | 0 |
| 0.8701388888888889 | 0 |
| 0.8708333333333332 | 0 |
| 0.8715277777777778 | 0 |
| 0.8722222222222222 | 0 |
| 0.8729166666666667 | 0 |
| 0.873611111111111 | 0 |
| 0.8743055555555556 | 0 |
| 0.875 | 0 |
| 0.8756944444444444 | 0 |
| 0.876388888888889 | 0 |
| 0.8770833333333333 | 0 |
| 0.8777777777777778 | 0 |
| 0.8784722222222222 | 0 |
| 0.8791666666666668 | 0 |
| 0.8798611111111111 | 0 |
| 0.8805555555555555 | 0 |
| 0.88125 | 0 |
| 0.8819444444444445 | 0 |
| 0.8826388888888889 | 0 |
| 0.8833333333333333 | 0 |
| 0.8840277777777777 | 0 |
| 0.8847222222222223 | 0 |
| 0.8854166666666666 | 0 |
| 0.8861111111111111 | 0 |
| 0.8868055555555556 | 0 |
| 0.8875000000000001 | 0 |
| 0.8881944444444444 | 0 |
| 0.8888888888888888 | 0 |
| 0.8895833333333334 | 0 |
| 0.8902777777777778 | 0 |
| 0.8909722222222222 | 0 |
| 0.8916666666666666 | 0 |
| 0.8923611111111112 | 0 |
| 0.8930555555555556 | 0 |
| 0.8937499999999999 | 0 |
| 0.8944444444444444 | 0 |
| 0.8951388888888889 | 0 |
| 0.8958333333333334 | 0 |
| 0.8965277777777777 | 0 |
| 0.8972222222222223 | 0 |
| 0.8979166666666667 | 0 |
| 0.8986111111111111 | 0 |
| 0.8993055555555555 | 0 |
| 0.9 | 0 |
| 0.9006944444444445 | 0 |
| 0.9013888888888889 | 0 |
| 0.9020833333333332 | 0 |
| 0.9027777777777778 | 0 |
| 0.9034722222222222 | 0 |
| 0.9041666666666667 | 0 |
| 0.904861111111111 | 0 |
| 0.9055555555555556 | 0 |
| 0.90625 | 0 |
| 0.9069444444444444 | 0 |
| 0.907638888888889 | 0 |
| 0.9083333333333333 | 0 |
| 0.9090277777777778 | 0 |
| 0.9097222222222222 | 0 |
| 0.9104166666666668 | 0 |
| 0.9111111111111111 | 0 |
| 0.9118055555555555 | 0 |
| 0.9125 | 0 |
| 0.9131944444444445 | 0 |
| 0.9138888888888889 | 0 |
| 0.9145833333333333 | 0 |
| 0.9152777777777777 | 0 |
| 0.9159722222222223 | 0 |
| 0.9166666666666666 | 0 |
| 0.9173611111111111 | 0 |
| 0.9180555555555556 | 0 |
| 0.9187500000000001 | 0 |
| 0.9194444444444444 | 0 |
| 0.9201388888888888 | 0 |
| 0.9208333333333334 | 0 |
| 0.9215277777777778 | 0 |
| 0.9222222222222222 | 0 |
| 0.9229166666666666 | 0 |
| 0.9236111111111112 | 0 |
| 0.9243055555555556 | 0 |
| 0.9249999999999999 | 0 |
| 0.9256944444444444 | 0 |
| 0.9263888888888889 | 0 |
| 0.9270833333333334 | 0 |
| 0.9277777777777777 | 0 |
| 0.9284722222222223 | 0 |
| 0.9291666666666667 | 0 |
| 0.9298611111111111 | 0 |
| 0.9305555555555555 | 0 |
| 0.93125 | 0 |
| 0.9319444444444445 | 0 |
| 0.9326388888888889 | 0 |
| 0.9333333333333332 | 0 |
| 0.9340277777777778 | 0 |
| 0.9347222222222222 | 0 |
| 0.9354166666666667 | 0 |
| 0.936111111111111 | 0 |
| 0.9368055555555556 | 0 |
| 0.9375 | 0 |
| 0.9381944444444444 | 0 |
| 0.938888888888889 | 0 |
| 0.9395833333333333 | 0 |
| 0.9402777777777778 | 0 |
| 0.9409722222222222 | 0 |
| 0.9416666666666668 | 0 |
| 0.9423611111111111 | 0 |
| 0.9430555555555555 | 0 |
| 0.94375 | 0 |
| 0.9444444444444445 | 0 |
| 0.9451388888888889 | 0 |
| 0.9458333333333333 | 0 |
| 0.9465277777777777 | 0 |
| 0.9472222222222223 | 0 |
| 0.9479166666666666 | 0 |
| 0.9486111111111111 | 0 |
| 0.9493055555555556 | 0 |
| 0.9500000000000001 | 0 |
| 0.9506944444444444 | 0 |
| 0.9513888888888888 | 0 |
| 0.9520833333333334 | 0 |
| 0.9527777777777778 | 0 |
| 0.9534722222222222 | 0 |
| 0.9541666666666666 | 0 |
| 0.9548611111111112 | 0 |
| 0.9555555555555556 | 0 |
| 0.9562499999999999 | 0 |
| 0.9569444444444444 | 0 |
| 0.9576388888888889 | 0 |
| 0.9583333333333334 | 0 |
| 0.9590277777777777 | 0 |
| 0.9597222222222223 | 0 |
| 0.9604166666666667 | 0 |
| 0.9611111111111111 | 0 |
| 0.9618055555555555 | 0 |
| 0.9625 | 0 |
| 0.9631944444444445 | 0 |
| 0.9638888888888889 | 0 |
| 0.9645833333333332 | 0 |
| 0.9652777777777778 | 0 |
| 0.9659722222222222 | 0 |
| 0.9666666666666667 | 0 |
| 0.967361111111111 | 0 |
| 0.9680555555555556 | 0 |
| 0.96875 | 0 |
| 0.9694444444444444 | 0 |
| 0.970138888888889 | 0 |
| 0.9708333333333333 | 0 |
| 0.9715277777777778 | 0 |
| 0.9722222222222222 | 0 |
| 0.9729166666666668 | 0 |
| 0.9736111111111111 | 0 |
| 0.9743055555555555 | 0 |
| 0.975 | 0 |
| 0.9756944444444445 | 0 |
| 0.9763888888888889 | 0 |
| 0.9770833333333333 | 0 |
| 0.9777777777777777 | 0 |
| 0.9784722222222223 | 0 |
| 0.9791666666666666 | 0 |
| 0.9798611111111111 | 0 |
| 0.9805555555555556 | 0 |
| 0.9812500000000001 | 0 |
| 0.9819444444444444 | 0 |
| 0.9826388888888888 | 0 |
| 0.9833333333333334 | 0 |
| 0.9840277777777778 | 0 |
| 0.9847222222222222 | 0 |
| 0.9854166666666666 | 0 |
| 0.9861111111111112 | 0 |
| 0.9868055555555556 | 0 |
| 0.9874999999999999 | 0 |
| 0.9881944444444444 | 0 |
| 0.9888888888888889 | 0 |
| 0.9895833333333334 | 0 |
| 0.9902777777777777 | 0 |
| 0.9909722222222223 | 0 |
| 0.9916666666666667 | 0 |
| 0.9923611111111111 | 0 |
| 0.9930555555555555 | 0 |
| 0.99375 | 0 |
| 0.9944444444444445 | 0 |
| 0.9951388888888889 | 0 |
| 0.9958333333333332 | 0 |
| 0.9965277777777778 | 0 |
| 0.9972222222222222 | 0 |
| 0.9979166666666667 | 0 |
| 0.998611111111111 | 0 |
| 0.9993055555555556 | 0 |